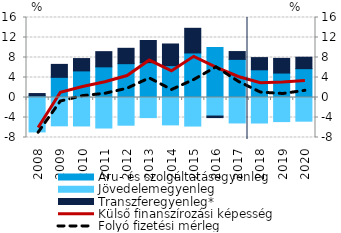
| Category | Áru- és szolgáltatásegyenleg | Jövedelemegyenleg | Transzferegyenleg* |
|---|---|---|---|
| 2008.0 | 0.357 | -6.883 | 0.435 |
| 2009.0 | 4.031 | -5.668 | 2.592 |
| 2010.0 | 5.32 | -5.693 | 2.467 |
| 2011.0 | 6.13 | -6.106 | 3.042 |
| 2012.0 | 6.766 | -5.543 | 3.075 |
| 2013.0 | 6.964 | -4.021 | 4.439 |
| 2014.0 | 6.376 | -5.476 | 4.328 |
| 2015.0 | 8.905 | -5.71 | 4.936 |
| 2016.0 | 10.015 | -3.706 | -0.313 |
| 2017.0 | 7.623 | -5.09 | 1.567 |
| 2018.0 | 5.537 | -5.106 | 2.442 |
| 2019.0 | 4.886 | -4.821 | 2.938 |
| 2020.0 | 5.769 | -4.736 | 2.288 |